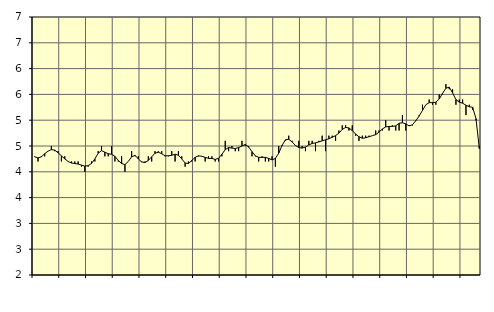
| Category | Piggar | Personliga och kulturella tjänster, SNI 90-98 |
|---|---|---|
| nan | 4.3 | 4.29 |
| 87.0 | 4.2 | 4.27 |
| 87.0 | 4.3 | 4.29 |
| 87.0 | 4.3 | 4.35 |
| nan | 4.4 | 4.4 |
| 88.0 | 4.5 | 4.43 |
| 88.0 | 4.4 | 4.42 |
| 88.0 | 4.4 | 4.37 |
| nan | 4.2 | 4.31 |
| 89.0 | 4.3 | 4.25 |
| 89.0 | 4.2 | 4.2 |
| 89.0 | 4.2 | 4.17 |
| nan | 4.2 | 4.16 |
| 90.0 | 4.2 | 4.15 |
| 90.0 | 4.1 | 4.13 |
| 90.0 | 4 | 4.11 |
| nan | 4.1 | 4.12 |
| 91.0 | 4.2 | 4.16 |
| 91.0 | 4.2 | 4.25 |
| 91.0 | 4.4 | 4.36 |
| nan | 4.5 | 4.41 |
| 92.0 | 4.3 | 4.38 |
| 92.0 | 4.3 | 4.35 |
| 92.0 | 4.5 | 4.34 |
| nan | 4.2 | 4.3 |
| 93.0 | 4.2 | 4.22 |
| 93.0 | 4.3 | 4.16 |
| 93.0 | 4 | 4.14 |
| nan | 4.2 | 4.2 |
| 94.0 | 4.4 | 4.29 |
| 94.0 | 4.3 | 4.32 |
| 94.0 | 4.3 | 4.25 |
| nan | 4.2 | 4.19 |
| 95.0 | 4.2 | 4.18 |
| 95.0 | 4.3 | 4.22 |
| 95.0 | 4.2 | 4.29 |
| nan | 4.4 | 4.36 |
| 96.0 | 4.4 | 4.38 |
| 96.0 | 4.4 | 4.35 |
| 96.0 | 4.3 | 4.31 |
| nan | 4.3 | 4.31 |
| 97.0 | 4.4 | 4.32 |
| 97.0 | 4.2 | 4.34 |
| 97.0 | 4.4 | 4.32 |
| nan | 4.3 | 4.25 |
| 98.0 | 4.1 | 4.17 |
| 98.0 | 4.2 | 4.16 |
| 98.0 | 4.2 | 4.22 |
| nan | 4.2 | 4.28 |
| 99.0 | 4.3 | 4.31 |
| 99.0 | 4.3 | 4.3 |
| 99.0 | 4.2 | 4.28 |
| nan | 4.3 | 4.26 |
| 0.0 | 4.3 | 4.26 |
| 0.0 | 4.2 | 4.24 |
| 0.0 | 4.2 | 4.26 |
| nan | 4.3 | 4.34 |
| 1.0 | 4.6 | 4.43 |
| 1.0 | 4.4 | 4.47 |
| 1.0 | 4.5 | 4.46 |
| nan | 4.4 | 4.45 |
| 2.0 | 4.4 | 4.47 |
| 2.0 | 4.6 | 4.5 |
| 2.0 | 4.5 | 4.53 |
| nan | 4.5 | 4.48 |
| 3.0 | 4.3 | 4.39 |
| 3.0 | 4.3 | 4.31 |
| 3.0 | 4.2 | 4.28 |
| nan | 4.3 | 4.28 |
| 4.0 | 4.2 | 4.28 |
| 4.0 | 4.2 | 4.26 |
| 4.0 | 4.3 | 4.23 |
| nan | 4.1 | 4.26 |
| 5.0 | 4.5 | 4.36 |
| 5.0 | 4.5 | 4.51 |
| 5.0 | 4.6 | 4.62 |
| nan | 4.7 | 4.63 |
| 6.0 | 4.6 | 4.58 |
| 6.0 | 4.5 | 4.51 |
| 6.0 | 4.6 | 4.47 |
| nan | 4.5 | 4.46 |
| 7.0 | 4.4 | 4.48 |
| 7.0 | 4.6 | 4.52 |
| 7.0 | 4.6 | 4.55 |
| nan | 4.4 | 4.56 |
| 8.0 | 4.6 | 4.58 |
| 8.0 | 4.7 | 4.6 |
| 8.0 | 4.4 | 4.62 |
| nan | 4.7 | 4.64 |
| 9.0 | 4.7 | 4.67 |
| 9.0 | 4.6 | 4.7 |
| 9.0 | 4.8 | 4.75 |
| nan | 4.9 | 4.82 |
| 10.0 | 4.9 | 4.86 |
| 10.0 | 4.8 | 4.85 |
| 10.0 | 4.9 | 4.8 |
| nan | 4.7 | 4.73 |
| 11.0 | 4.6 | 4.68 |
| 11.0 | 4.7 | 4.65 |
| 11.0 | 4.7 | 4.66 |
| nan | 4.7 | 4.68 |
| 12.0 | 4.7 | 4.7 |
| 12.0 | 4.8 | 4.72 |
| 12.0 | 4.8 | 4.77 |
| nan | 4.8 | 4.83 |
| 13.0 | 5 | 4.87 |
| 13.0 | 4.8 | 4.88 |
| 13.0 | 4.9 | 4.88 |
| nan | 4.8 | 4.89 |
| 14.0 | 4.8 | 4.94 |
| 14.0 | 5.1 | 4.95 |
| 14.0 | 4.8 | 4.93 |
| nan | 4.9 | 4.89 |
| 15.0 | 4.9 | 4.91 |
| 15.0 | 5 | 4.99 |
| 15.0 | 5.1 | 5.08 |
| nan | 5.3 | 5.19 |
| 16.0 | 5.3 | 5.3 |
| 16.0 | 5.4 | 5.34 |
| 16.0 | 5.3 | 5.34 |
| nan | 5.3 | 5.35 |
| 17.0 | 5.5 | 5.41 |
| 17.0 | 5.5 | 5.52 |
| 17.0 | 5.7 | 5.62 |
| nan | 5.6 | 5.64 |
| 18.0 | 5.6 | 5.53 |
| 18.0 | 5.3 | 5.4 |
| 18.0 | 5.4 | 5.35 |
| nan | 5.4 | 5.33 |
| 19.0 | 5.1 | 5.29 |
| 19.0 | 5.3 | 5.26 |
| 19.0 | 5.2 | 5.25 |
| nan | 5 | 5.03 |
| 20.0 | 4.5 | 4.45 |